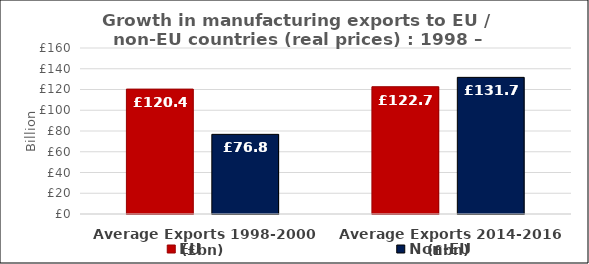
| Category | EU | Non-EU |
|---|---|---|
| Average Exports 1998-2000 (£bn) | 120.386 | 76.766 |
| Average Exports 2014-2016 (£bn) | 122.673 | 131.697 |